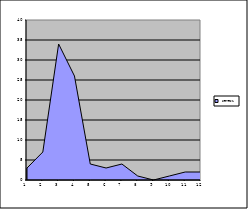
| Category | Series 0 |
|---|---|
| 0 | 3 |
| 1 | 7 |
| 2 | 34 |
| 3 | 26 |
| 4 | 4 |
| 5 | 3 |
| 6 | 4 |
| 7 | 1 |
| 8 | 0 |
| 9 | 1 |
| 10 | 2 |
| 11 | 2 |